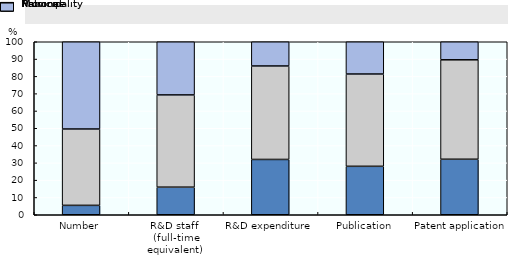
| Category | National | Province | Municipality |
|---|---|---|---|
| Number | 5.434 | 44.137 | 50.429 |
| R&D staff 
(full-time equivalent) | 15.942 | 53.327 | 30.731 |
| R&D expenditure | 31.971 | 54.024 | 14.005 |
| Publication | 28.007 | 53.345 | 18.648 |
| Patent application | 32.088 | 57.485 | 10.427 |